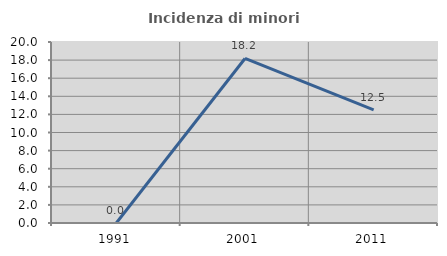
| Category | Incidenza di minori stranieri |
|---|---|
| 1991.0 | 0 |
| 2001.0 | 18.182 |
| 2011.0 | 12.5 |